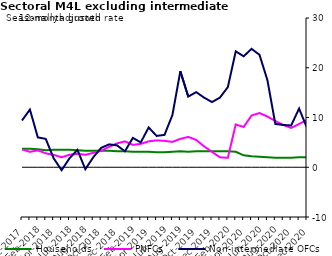
| Category | zero | Households | PNFCs | Non-intermediate OFCs |
|---|---|---|---|---|
| Dec-2017 | 0 | 3.7 | 3.6 | 9.4 |
| Jan-2018 | 0 | 3.7 | 3.1 | 11.6 |
| Feb-2018 | 0 | 3.6 | 3.4 | 6 |
| Mar-2018 | 0 | 3.4 | 2.8 | 5.7 |
| Apr-2018 | 0 | 3.5 | 2.5 | 1.8 |
| May-2018 | 0 | 3.5 | 2 | -0.6 |
| Jun-2018 | 0 | 3.5 | 2.5 | 1.8 |
| Jul-2018 | 0 | 3.4 | 2.7 | 3.5 |
| Aug-2018 | 0 | 3.3 | 2.5 | -0.4 |
| Sep-2018 | 0 | 3.3 | 2.9 | 2 |
| Oct-2018 | 0 | 3.3 | 3.3 | 3.9 |
| Nov-2018 | 0 | 3.3 | 4.1 | 4.6 |
| Dec-2018 | 0 | 3.2 | 4.8 | 4.4 |
| Jan-2019 | 0 | 3.2 | 5.2 | 3.2 |
| Feb-2019 | 0 | 3.1 | 4.5 | 5.9 |
| Mar-2019 | 0 | 3.1 | 4.7 | 5 |
| Apr-2019 | 0 | 3.1 | 5.2 | 8 |
| May-2019 | 0 | 3 | 5.4 | 6.3 |
| Jun-2019 | 0 | 3 | 5.3 | 6.5 |
| Jul-2019 | 0 | 3.1 | 5.1 | 10.5 |
| Aug-2019 | 0 | 3.2 | 5.7 | 19.3 |
| Sep-2019 | 0 | 3.1 | 6.1 | 14.2 |
| Oct-2019 | 0 | 3.2 | 5.5 | 15.1 |
| Nov-2019 | 0 | 3.2 | 4.2 | 14 |
| Dec-2019 | 0 | 3.2 | 3.1 | 13.1 |
| Jan-2020 | 0 | 3.2 | 2 | 14 |
| Feb-2020 | 0 | 3.2 | 1.9 | 16.1 |
| Mar-2020 | 0 | 3.1 | 8.6 | 23.3 |
| Apr-2020 | 0 | 2.4 | 8.1 | 22.3 |
| May-2020 | 0 | 2.2 | 10.4 | 23.8 |
| Jun-2020 | 0 | 2.1 | 10.9 | 22.6 |
| Jul-2020 | 0 | 2 | 10.2 | 17.5 |
| Aug-2020 | 0 | 1.9 | 9.3 | 8.7 |
| Sep-2020 | 0 | 1.9 | 8.5 | 8.5 |
| Oct-2020 | 0 | 1.9 | 7.9 | 8.4 |
| Nov-2020 | 0 | 2 | 8.7 | 11.8 |
| Dec-2020 | 0 | 2 | 9.5 | 7.9 |